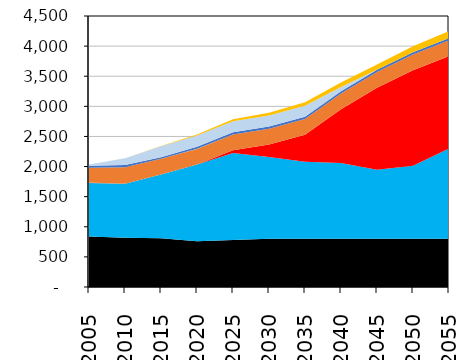
| Category | Series 0 | Series 2 | Series 3 | Series 4 | Series 1 | Series 5 | Series 6 | Series 7 | Series 8 | Series 9 | Series 10 | Series 11 | Series 12 | Series 13 |
|---|---|---|---|---|---|---|---|---|---|---|---|---|---|---|
| 2005.0 | 0 | 840.12 | 0 | 888.71 | 0 | 5.16 | 245.79 | 0 | 0 | 0.72 | 0 | 31.03 | 21.55 | 0 |
| 2010.0 | 0 | 818.93 | 0 | 893.76 | 0 | 0.73 | 275.39 | 0 | 0 | 0.72 | 0 | 36.33 | 110.37 | 0.02 |
| 2015.0 | 0 | 808.83 | 0 | 1058.19 | 0 | 0.51 | 261 | 0 | 0 | 0.72 | 0 | 25.04 | 184.36 | 3.24 |
| 2020.0 | 0 | 758.63 | 0 | 1273.66 | 0 | 0 | 261 | 0 | 0 | 0.72 | 0 | 36.33 | 184.36 | 17.33 |
| 2025.0 | 0 | 779.14 | 0 | 1445.09 | 47.09 | 0 | 261 | 0 | 0 | 0.72 | 0 | 36.33 | 184.36 | 31.4 |
| 2030.0 | 0 | 799.16 | 0 | 1360.71 | 206.54 | 0 | 261 | 0 | 0 | 0.72 | 0 | 36.33 | 184.36 | 45.49 |
| 2035.0 | 0 | 799.16 | 0 | 1281.6 | 446.67 | 0 | 261 | 0 | 0 | 0.72 | 0 | 36.33 | 184.36 | 59.56 |
| 2040.0 | 0 | 799.16 | 0 | 1258.35 | 893.96 | 0 | 261 | 0 | 0 | 0.72 | 0 | 36.33 | 71.81 | 73.65 |
| 2045.0 | 0 | 799.16 | 0 | 1147.9 | 1362.45 | 0 | 261.01 | 0 | 0 | 0.72 | 0 | 36.33 | 0 | 87.73 |
| 2050.0 | 0 | 799.16 | 0 | 1215.63 | 1584.91 | 0 | 261.01 | 0 | 0 | 0 | 0 | 36.33 | 0 | 101.8 |
| 2055.0 | 0 | 799.16 | 0 | 1498.25 | 1537.82 | 0 | 261.01 | 0 | 0 | 0 | 0 | 36.33 | 0 | 115.89 |